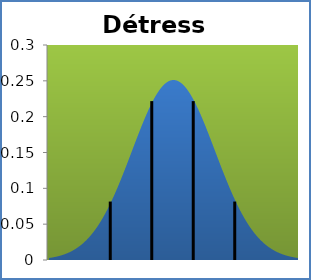
| Category | densité |
|---|---|
| -1.8600000000000003 | 0.003 |
| -1.7806000000000006 | 0.003 |
| -1.7012 | 0.004 |
| -1.6218000000000004 | 0.004 |
| -1.5423999999999998 | 0.005 |
| -1.463 | 0.006 |
| -1.3836000000000004 | 0.007 |
| -1.3041999999999998 | 0.008 |
| -1.2248 | 0.009 |
| -1.1454000000000004 | 0.01 |
| -1.0660000000000003 | 0.011 |
| -0.9866000000000001 | 0.012 |
| -0.9072000000000005 | 0.014 |
| -0.8278000000000008 | 0.016 |
| -0.7484000000000002 | 0.018 |
| -0.6690000000000005 | 0.02 |
| -0.5895999999999999 | 0.022 |
| -0.5102000000000002 | 0.025 |
| -0.43080000000000007 | 0.028 |
| -0.3514000000000004 | 0.031 |
| -0.27200000000000024 | 0.034 |
| -0.1926000000000001 | 0.038 |
| -0.11319999999999997 | 0.041 |
| -0.033800000000000274 | 0.045 |
| 0.04559999999999942 | 0.05 |
| 0.12499999999999956 | 0.054 |
| 0.2043999999999997 | 0.059 |
| 0.28379999999999983 | 0.064 |
| 0.36319999999999997 | 0.07 |
| 0.44259999999999966 | 0.076 |
| 0.5219999999999998 | 0.082 |
| 0.6013999999999999 | 0.088 |
| 0.6808000000000001 | 0.094 |
| 0.7601999999999998 | 0.101 |
| 0.8395999999999999 | 0.108 |
| 0.9189999999999998 | 0.115 |
| 0.9983999999999997 | 0.122 |
| 1.0777999999999999 | 0.13 |
| 1.1572 | 0.137 |
| 1.2366 | 0.145 |
| 1.3159999999999998 | 0.152 |
| 1.3954 | 0.16 |
| 1.4747999999999997 | 0.168 |
| 1.5541999999999998 | 0.175 |
| 1.6336 | 0.182 |
| 1.7129999999999999 | 0.19 |
| 1.7924 | 0.197 |
| 1.8718 | 0.203 |
| 1.9511999999999998 | 0.21 |
| 2.0305999999999997 | 0.216 |
| 2.11 | 0.222 |
| 2.1894 | 0.227 |
| 2.2687999999999997 | 0.232 |
| 2.3482 | 0.236 |
| 2.4276 | 0.24 |
| 2.5069999999999997 | 0.243 |
| 2.5864 | 0.246 |
| 2.6658 | 0.248 |
| 2.7452 | 0.25 |
| 2.8245999999999998 | 0.251 |
| 2.904 | 0.251 |
| 2.9834 | 0.251 |
| 3.0627999999999997 | 0.25 |
| 3.1422 | 0.248 |
| 3.2216 | 0.246 |
| 3.301 | 0.243 |
| 3.3804 | 0.24 |
| 3.4598 | 0.236 |
| 3.5392 | 0.232 |
| 3.6186 | 0.227 |
| 3.698 | 0.222 |
| 3.7774 | 0.216 |
| 3.8568 | 0.21 |
| 3.9362 | 0.203 |
| 4.0156 | 0.197 |
| 4.095 | 0.19 |
| 4.1744 | 0.182 |
| 4.2538 | 0.175 |
| 4.3332 | 0.168 |
| 4.412599999999999 | 0.16 |
| 4.492 | 0.152 |
| 4.5714 | 0.145 |
| 4.6508 | 0.137 |
| 4.7302 | 0.13 |
| 4.8096 | 0.122 |
| 4.889 | 0.115 |
| 4.9684 | 0.108 |
| 5.0478000000000005 | 0.101 |
| 5.1272 | 0.094 |
| 5.2066 | 0.088 |
| 5.286 | 0.082 |
| 5.3654 | 0.076 |
| 5.4448 | 0.07 |
| 5.5242 | 0.064 |
| 5.6036 | 0.059 |
| 5.683 | 0.054 |
| 5.7624 | 0.05 |
| 5.8418 | 0.045 |
| 5.9212 | 0.041 |
| 6.0006 | 0.038 |
| 6.08 | 0.034 |
| 6.1594 | 0.031 |
| 6.2387999999999995 | 0.028 |
| 6.3182 | 0.025 |
| 6.3976 | 0.022 |
| 6.477 | 0.02 |
| 6.5564 | 0.018 |
| 6.635800000000001 | 0.016 |
| 6.7152 | 0.014 |
| 6.7946 | 0.012 |
| 6.8740000000000006 | 0.011 |
| 6.9534 | 0.01 |
| 7.0328 | 0.009 |
| 7.1122 | 0.008 |
| 7.1916 | 0.007 |
| 7.271 | 0.006 |
| 7.3504 | 0.005 |
| 7.4298 | 0.004 |
| 7.5092 | 0.004 |
| 7.5886000000000005 | 0.003 |
| 7.668 | 0.003 |